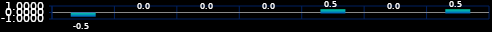
| Category | Series 0 |
|---|---|
| 0 | -0.5 |
| 1 | 0 |
| 2 | 0 |
| 3 | 0 |
| 4 | 0.5 |
| 5 | 0 |
| 6 | 0.5 |